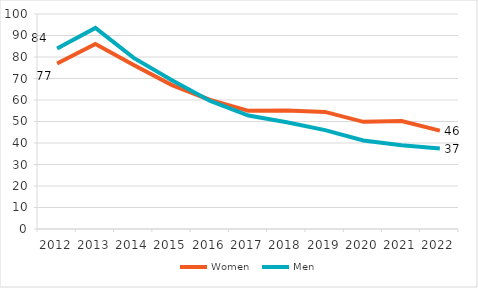
| Category | Women | Men |
|---|---|---|
| 2012.0 | 76.988 | 83.915 |
| 2013.0 | 86.068 | 93.489 |
| 2014.0 | 76.261 | 79.579 |
| 2015.0 | 66.948 | 69.226 |
| 2016.0 | 60.009 | 59.561 |
| 2017.0 | 54.949 | 52.754 |
| 2018.0 | 55.124 | 49.615 |
| 2019.0 | 54.458 | 45.997 |
| 2020.0 | 49.844 | 41.183 |
| 2021.0 | 50.203 | 38.965 |
| 2022.0 | 45.741 | 37.403 |